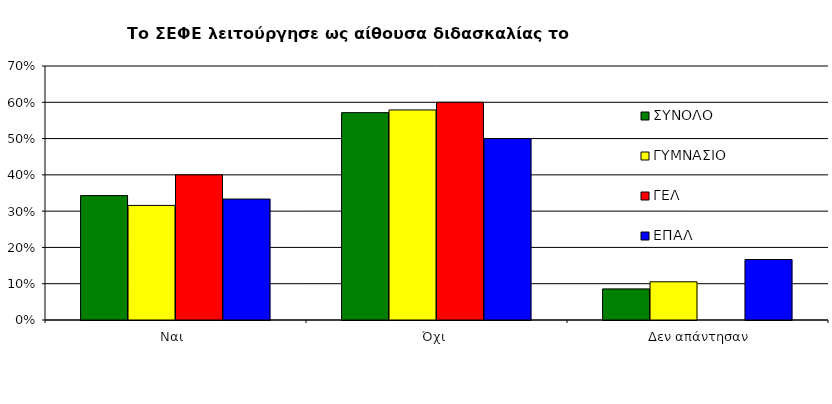
| Category | ΣΥΝΟΛΟ | ΓΥΜΝΑΣΙΟ | ΓΕΛ | ΕΠΑΛ |
|---|---|---|---|---|
| Ναι  | 0.343 | 0.316 | 0.4 | 0.333 |
| Όχι  | 0.571 | 0.579 | 0.6 | 0.5 |
|  Δεν απάντησαν | 0.086 | 0.105 | 0 | 0.167 |